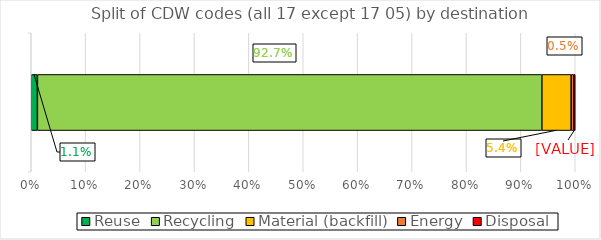
| Category | Reuse | Recycling | Material (backfill) | Energy | Disposal |
|---|---|---|---|---|---|
|  | 0.011 | 0.927 | 0.054 | 0.005 | 0.003 |